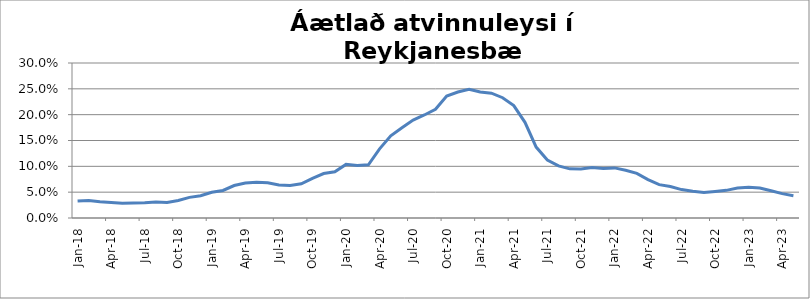
| Category | Series 0 |
|---|---|
| 2018-01-01 | 0.033 |
| 2018-02-01 | 0.034 |
| 2018-03-01 | 0.031 |
| 2018-04-01 | 0.03 |
| 2018-05-01 | 0.028 |
| 2018-06-01 | 0.029 |
| 2018-07-01 | 0.03 |
| 2018-08-01 | 0.031 |
| 2018-09-01 | 0.03 |
| 2018-10-01 | 0.034 |
| 2018-11-01 | 0.04 |
| 2018-12-01 | 0.043 |
| 2019-01-01 | 0.05 |
| 2019-02-01 | 0.053 |
| 2019-03-01 | 0.063 |
| 2019-04-01 | 0.068 |
| 2019-05-01 | 0.069 |
| 2019-06-01 | 0.068 |
| 2019-07-01 | 0.064 |
| 2019-08-01 | 0.063 |
| 2019-09-01 | 0.066 |
| 2019-10-01 | 0.077 |
| 2019-11-01 | 0.086 |
| 2019-12-01 | 0.089 |
| 2020-01-01 | 0.104 |
| 2020-02-01 | 0.102 |
| 2020-03-01 | 0.103 |
| 2020-04-01 | 0.134 |
| 2020-05-01 | 0.159 |
| 2020-06-01 | 0.175 |
| 2020-07-01 | 0.189 |
| 2020-08-01 | 0.199 |
| 2020-09-01 | 0.21 |
| 2020-10-01 | 0.236 |
| 2020-11-01 | 0.244 |
| 2020-12-01 | 0.249 |
| 2021-01-01 | 0.244 |
| 2021-02-01 | 0.242 |
| 2021-03-01 | 0.233 |
| 2021-04-01 | 0.218 |
| 2021-05-01 | 0.185 |
| 2021-06-01 | 0.137 |
| 2021-07-01 | 0.112 |
| 2021-08-01 | 0.101 |
| 2021-09-01 | 0.095 |
| 2021-10-01 | 0.095 |
| 2021-11-01 | 0.098 |
| 2021-12-01 | 0.096 |
| 2022-01-01 | 0.097 |
| 2022-02-01 | 0.092 |
| 2022-03-01 | 0.086 |
| 2022-04-01 | 0.074 |
| 2022-05-01 | 0.065 |
| 2022-06-01 | 0.061 |
| 2022-07-01 | 0.055 |
| 2022-08-01 | 0.052 |
| 2022-09-01 | 0.049 |
| 2022-10-01 | 0.051 |
| 2022-11-01 | 0.053 |
| 2022-12-01 | 0.058 |
| 2023-01-01 | 0.06 |
| 2023-02-01 | 0.058 |
| 2023-03-01 | 0.053 |
| 2023-04-01 | 0.047 |
| 2023-05-01 | 0.043 |